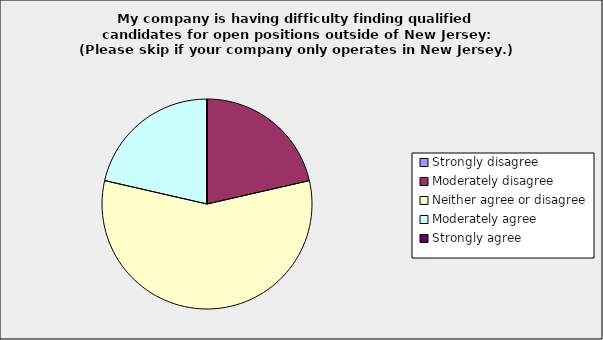
| Category | Series 0 |
|---|---|
| Strongly disagree | 0 |
| Moderately disagree | 0.214 |
| Neither agree or disagree | 0.571 |
| Moderately agree | 0.214 |
| Strongly agree | 0 |